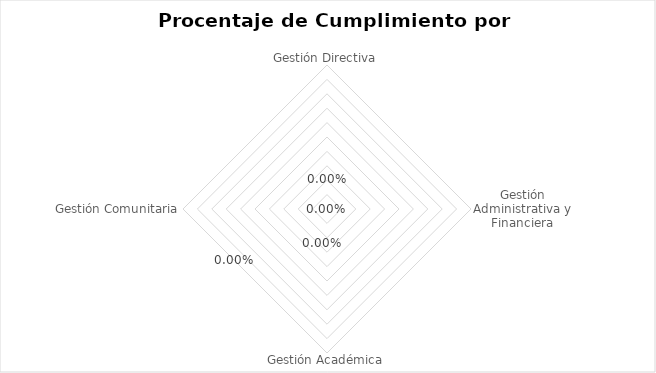
| Category | Series 0 |
|---|---|
| Gestión Directiva | 0 |
| Gestión Administrativa y Financiera | 0 |
| Gestión Académica | 0 |
| Gestión Comunitaria | 0 |